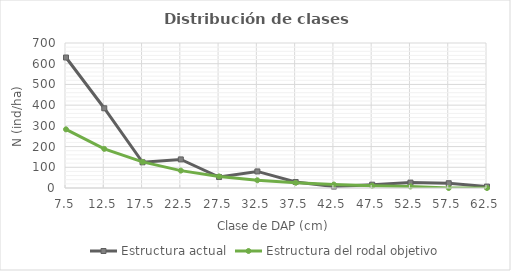
| Category | Estructura actual | Estructura del rodal objetivo |
|---|---|---|
| 7.5 | 630 | 283.217 |
| 12.5 | 385 | 188.811 |
| 17.5 | 124 | 125.874 |
| 22.5 | 138 | 83.916 |
| 27.5 | 53 | 55.944 |
| 32.5 | 80 | 37.296 |
| 37.5 | 29 | 24.864 |
| 42.5 | 7 | 16.576 |
| 47.5 | 16 | 11.051 |
| 52.5 | 26 | 7.367 |
| 57.5 | 23 | 0 |
| 62.5 | 7 | 0 |